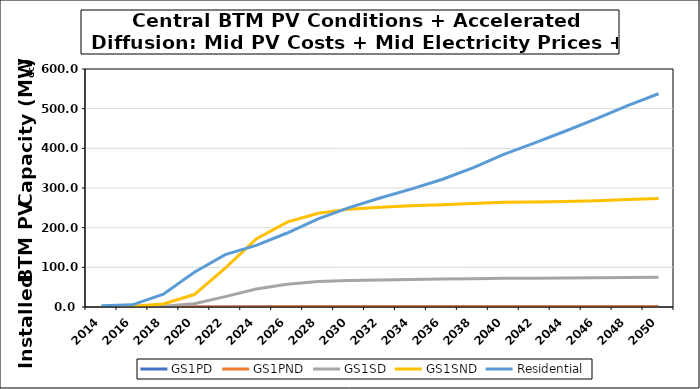
| Category | GS1PD | GS1PND | GS1SD | GS1SND | Residential |
|---|---|---|---|---|---|
| 2014.0 | 0 | 0 | 0.382 | 1.269 | 3.168 |
| 2016.0 | 0 | 0 | 0.597 | 2.097 | 5.467 |
| 2018.0 | 0.011 | 0.004 | 2.051 | 7.528 | 32.442 |
| 2020.0 | 0.06 | 0.025 | 8.447 | 31.423 | 87.776 |
| 2022.0 | 0.244 | 0.102 | 26.115 | 98.115 | 132.112 |
| 2024.0 | 0.579 | 0.246 | 45.181 | 171.529 | 155.253 |
| 2026.0 | 0.852 | 0.36 | 57.303 | 214.056 | 186.534 |
| 2028.0 | 0.998 | 0.419 | 64.531 | 236.483 | 221.938 |
| 2030.0 | 1.046 | 0.442 | 66.671 | 246.717 | 250.713 |
| 2032.0 | 1.078 | 0.458 | 68.226 | 251.713 | 274.648 |
| 2034.0 | 1.099 | 0.467 | 69.327 | 255.109 | 297.184 |
| 2036.0 | 1.12 | 0.476 | 70.276 | 257.918 | 321.474 |
| 2038.0 | 1.142 | 0.484 | 71.4 | 261.186 | 350.497 |
| 2040.0 | 1.161 | 0.491 | 72.298 | 264.209 | 384.879 |
| 2042.0 | 1.165 | 0.492 | 72.476 | 264.818 | 413.967 |
| 2044.0 | 1.172 | 0.495 | 72.842 | 266.024 | 443.686 |
| 2046.0 | 1.182 | 0.5 | 73.44 | 268.005 | 475.138 |
| 2048.0 | 1.197 | 0.505 | 74.397 | 270.721 | 507.871 |
| 2050.0 | 1.212 | 0.51 | 75.198 | 273.316 | 537.544 |